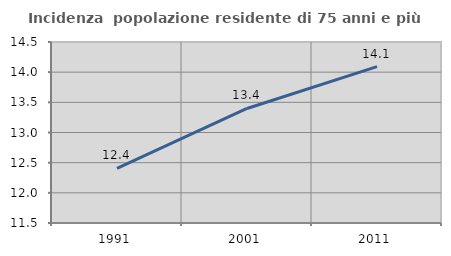
| Category | Incidenza  popolazione residente di 75 anni e più |
|---|---|
| 1991.0 | 12.405 |
| 2001.0 | 13.398 |
| 2011.0 | 14.092 |